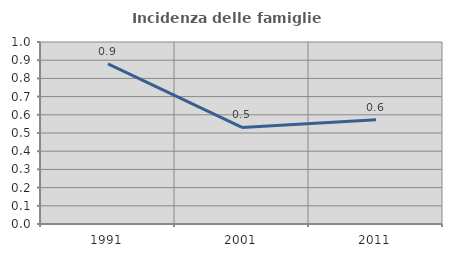
| Category | Incidenza delle famiglie numerose |
|---|---|
| 1991.0 | 0.88 |
| 2001.0 | 0.531 |
| 2011.0 | 0.573 |